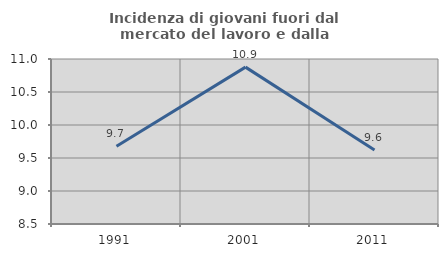
| Category | Incidenza di giovani fuori dal mercato del lavoro e dalla formazione  |
|---|---|
| 1991.0 | 9.679 |
| 2001.0 | 10.877 |
| 2011.0 | 9.621 |